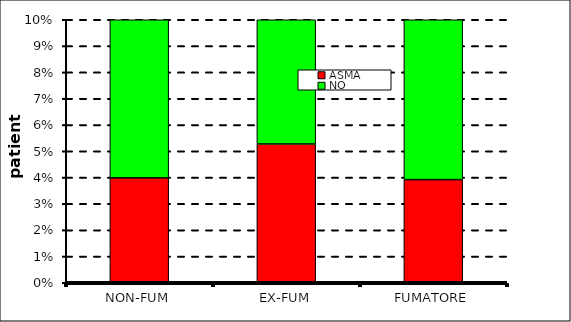
| Category | ASMA | NO |
|---|---|---|
| NON-FUM | 41 | 987 |
| EX-FUM | 20 | 359 |
| FUMATORE | 26 | 637 |